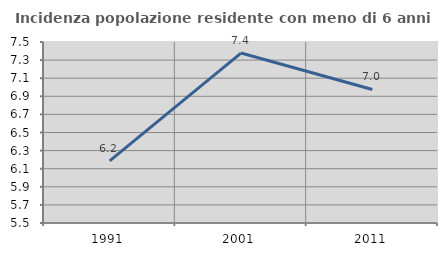
| Category | Incidenza popolazione residente con meno di 6 anni |
|---|---|
| 1991.0 | 6.187 |
| 2001.0 | 7.378 |
| 2011.0 | 6.975 |